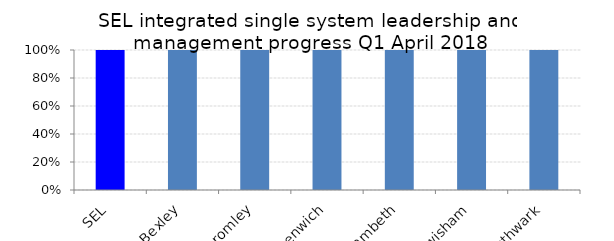
| Category | Series 0 |
|---|---|
| SEL | 1 |
| Bexley | 1 |
| Bromley | 1 |
| Greenwich | 1 |
| Lambeth | 1 |
| Lewisham | 1 |
| Southwark | 1 |